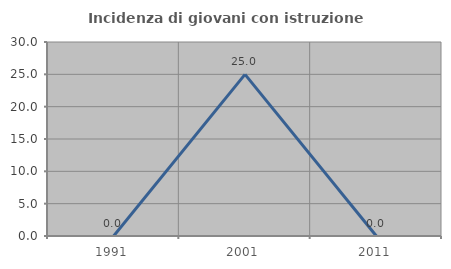
| Category | Incidenza di giovani con istruzione universitaria |
|---|---|
| 1991.0 | 0 |
| 2001.0 | 25 |
| 2011.0 | 0 |